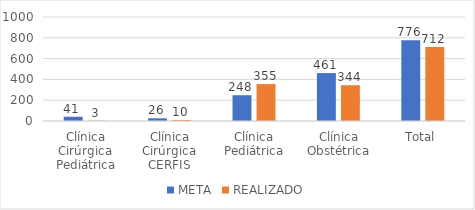
| Category | META | REALIZADO |
|---|---|---|
| Clínica Cirúrgica Pediátrica | 41 | 3 |
| Clínica Cirúrgica CERFIS | 26 | 10 |
| Clínica Pediátrica | 248 | 355 |
| Clínica Obstétrica | 461 | 344 |
| Total | 776 | 712 |